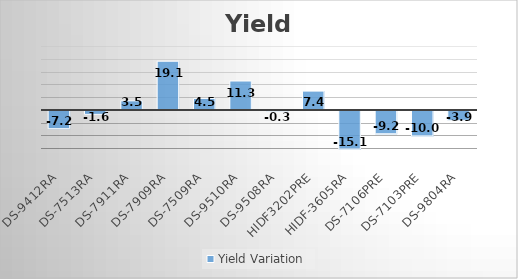
| Category | Yield Variation |
|---|---|
| DS-9412RA | -7.16 |
| DS-7513RA | -1.56 |
| DS-7911RA | 3.54 |
| DS-7909RA | 19.05 |
| DS-7509RA | 4.49 |
| DS-9510RA | 11.3 |
| DS-9508RA | -0.35 |
| HIDF3202PRE | 7.36 |
| HIDF-3605RA | -15.12 |
| DS-7106PRE | -9.15 |
| DS-7103PRE | -9.99 |
| DS-9804RA | -3.9 |